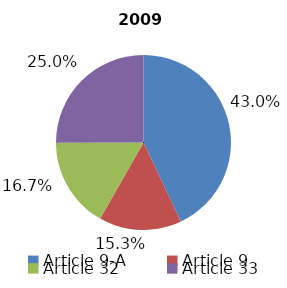
| Category | 2009 |
|---|---|
| Article 9-A | 1887059795 |
| Article 9 | 670069829 |
| Article 32 | 735381430 |
| Article 33 | 1098984779 |